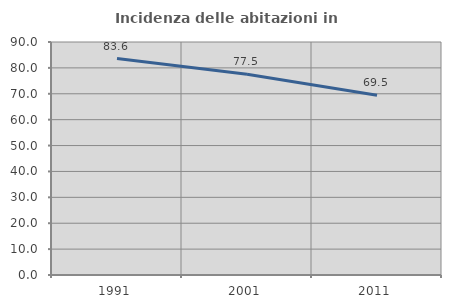
| Category | Incidenza delle abitazioni in proprietà  |
|---|---|
| 1991.0 | 83.621 |
| 2001.0 | 77.519 |
| 2011.0 | 69.466 |